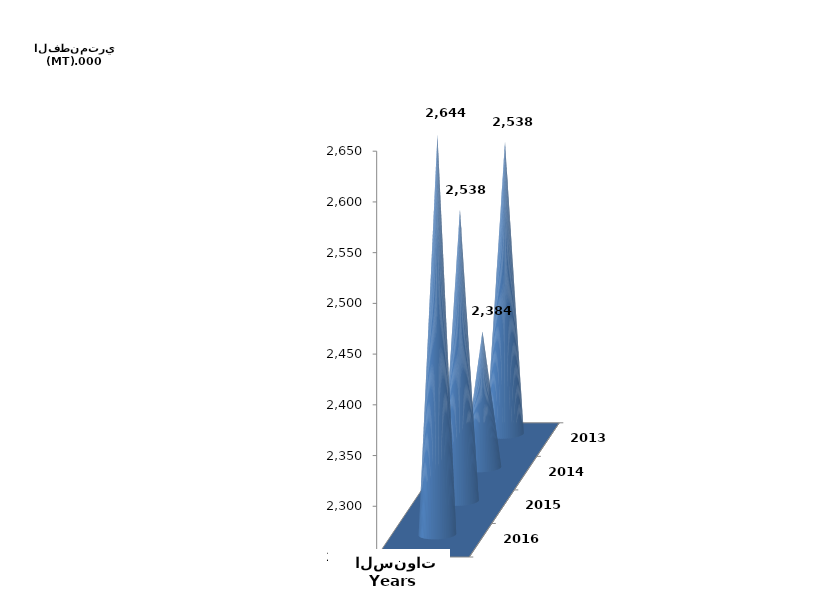
| Category | Series 0 | Series 1 |
|---|---|---|
| 2013 | 2537681 |  |
| 2014 | 2384311 |  |
| 2015 | 2537530 |  |
| 2016 | 2643727.953 |  |